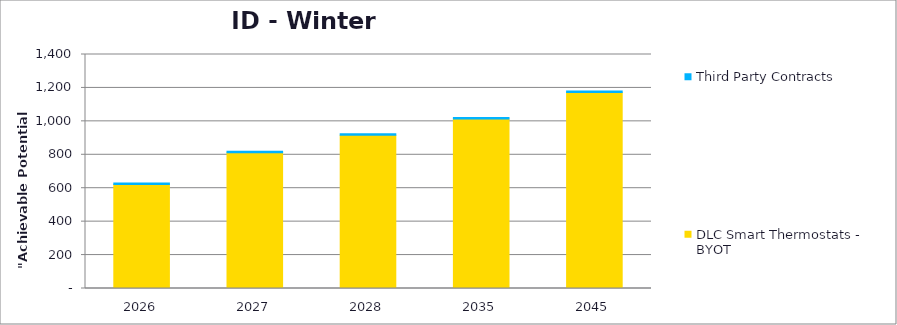
| Category | DLC Smart Thermostats - BYOT | Third Party Contracts |
|---|---|---|
| 2026.0 | 622.049 | 8.493 |
| 2027.0 | 812.649 | 8.496 |
| 2028.0 | 916.729 | 8.499 |
| 2035.0 | 1014.782 | 8.523 |
| 2045.0 | 1172.801 | 8.557 |